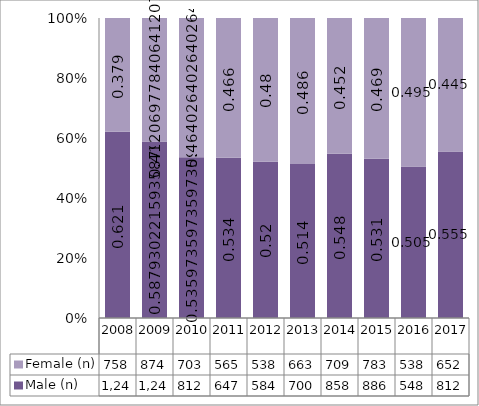
| Category | Male (n) | Female (n) |
|---|---|---|
| 2008.0 | 1242 | 758 |
| 2009.0 | 1247 | 874 |
| 2010.0 | 812 | 703 |
| 2011.0 | 647 | 565 |
| 2012.0 | 584 | 538 |
| 2013.0 | 700 | 663 |
| 2014.0 | 858 | 709 |
| 2015.0 | 886 | 783 |
| 2016.0 | 548 | 538 |
| 2017.0 | 812 | 652 |